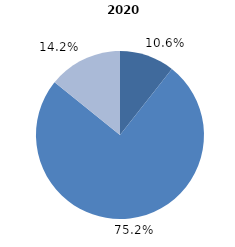
| Category | 2020 |
|---|---|
| cercetare fundamentală | 10.6 |
| cercetare aplicativă | 75.2 |
| dezvoltare tehnologică  | 14.2 |